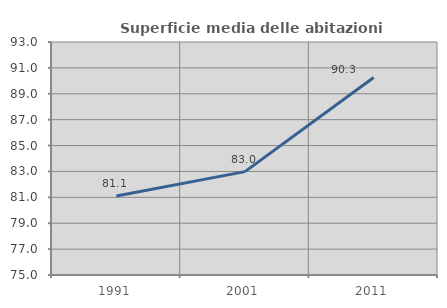
| Category | Superficie media delle abitazioni occupate |
|---|---|
| 1991.0 | 81.1 |
| 2001.0 | 82.986 |
| 2011.0 | 90.258 |